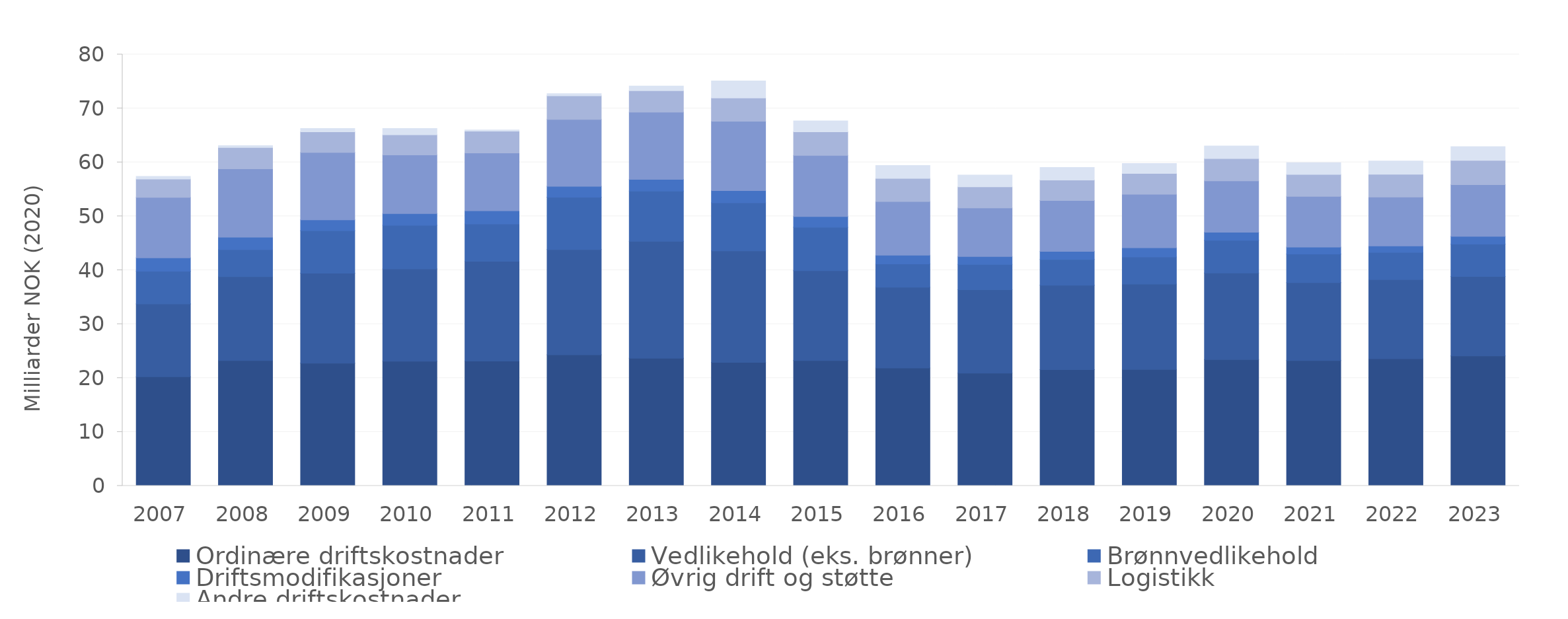
| Category | Ordinære driftskostnader | Vedlikehold (eks. brønner) | Brønnvedlikehold | Driftsmodifikasjoner | Øvrig drift og støtte | Logistikk | Andre driftskostnader |
|---|---|---|---|---|---|---|---|
| 2007.0 | 20.259 | 13.507 | 6.053 | 2.464 | 11.239 | 3.387 | 0.5 |
| 2008.0 | 23.249 | 15.565 | 5.003 | 2.295 | 12.694 | 3.961 | 0.337 |
| 2009.0 | 22.768 | 16.671 | 7.873 | 2.026 | 12.511 | 3.802 | 0.629 |
| 2010.0 | 23.113 | 17.127 | 8.083 | 2.182 | 10.865 | 3.757 | 1.16 |
| 2011.0 | 23.151 | 18.504 | 6.919 | 2.443 | 10.728 | 4.058 | 0.203 |
| 2012.0 | 24.329 | 19.488 | 9.707 | 2.023 | 12.426 | 4.361 | 0.394 |
| 2013.0 | 23.666 | 21.69 | 9.315 | 2.189 | 12.461 | 3.977 | 0.844 |
| 2014.0 | 22.909 | 20.662 | 8.916 | 2.288 | 12.853 | 4.31 | 3.147 |
| 2015.0 | 23.24 | 16.661 | 8.048 | 2.005 | 11.343 | 4.362 | 2.042 |
| 2016.0 | 21.883 | 14.955 | 4.327 | 1.621 | 9.952 | 4.286 | 2.401 |
| 2017.0 | 20.922 | 15.47 | 4.694 | 1.455 | 8.995 | 3.942 | 2.164 |
| 2018.0 | 21.553 | 15.657 | 4.794 | 1.502 | 9.404 | 3.828 | 2.317 |
| 2019.0 | 21.59 | 15.83 | 5.039 | 1.709 | 9.925 | 3.853 | 1.834 |
| 2020.0 | 23.443 | 16.04 | 6.047 | 1.502 | 9.545 | 4.139 | 2.327 |
| 2021.0 | 23.248 | 14.459 | 5.298 | 1.297 | 9.403 | 4.057 | 2.184 |
| 2022.0 | 23.596 | 14.656 | 5.066 | 1.182 | 9.083 | 4.209 | 2.461 |
| 2023.0 | 24.118 | 14.708 | 6.015 | 1.436 | 9.599 | 4.5 | 2.527 |